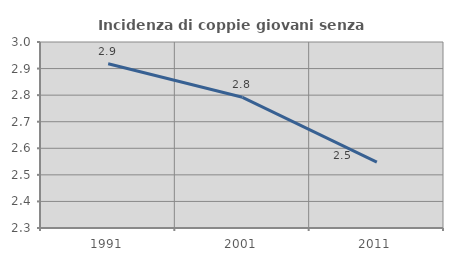
| Category | Incidenza di coppie giovani senza figli |
|---|---|
| 1991.0 | 2.918 |
| 2001.0 | 2.792 |
| 2011.0 | 2.548 |